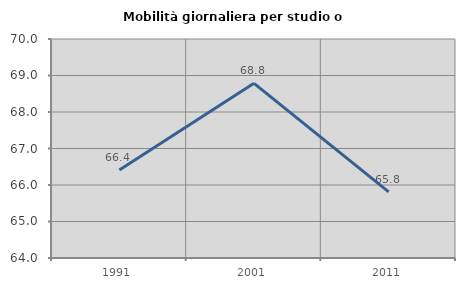
| Category | Mobilità giornaliera per studio o lavoro |
|---|---|
| 1991.0 | 66.408 |
| 2001.0 | 68.786 |
| 2011.0 | 65.811 |